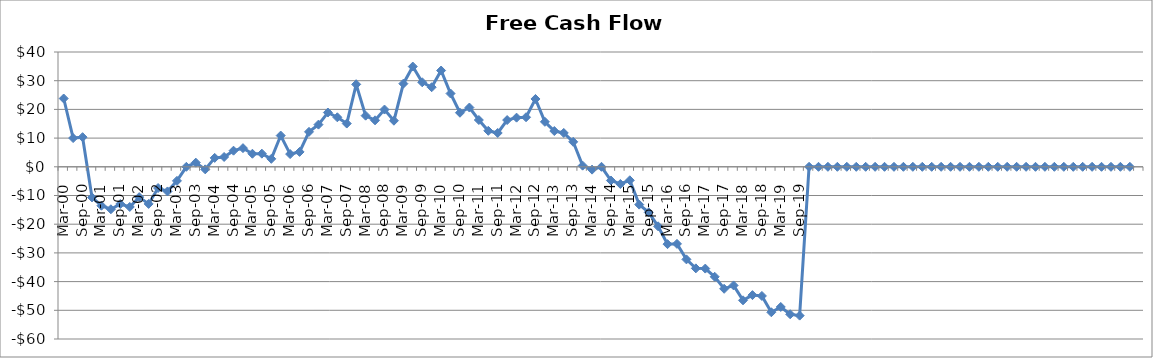
| Category | Series 0 |
|---|---|
| Mar-00 | 23.798 |
| Jun-00 | 10.012 |
| Sep-00 | 10.324 |
| Dec-00 | -10.677 |
| Mar-01 | -13.558 |
| Jun-01 | -14.799 |
| Sep-01 | -12.957 |
| Dec-01 | -13.993 |
| Mar-02 | -10.566 |
| Jun-02 | -12.934 |
| Sep-02 | -7.404 |
| Dec-02 | -8.587 |
| Mar-03 | -4.901 |
| Jun-03 | 0 |
| Sep-03 | 1.446 |
| Dec-03 | -0.888 |
| Mar-04 | 3.104 |
| Jun-04 | 3.423 |
| Sep-04 | 5.61 |
| Dec-04 | 6.5 |
| Mar-05 | 4.55 |
| Jun-05 | 4.58 |
| Sep-05 | 2.78 |
| Dec-05 | 10.888 |
| Mar-06 | 4.432 |
| Jun-06 | 5.189 |
| Sep-06 | 12.184 |
| Dec-06 | 14.7 |
| Mar-07 | 18.911 |
| Jun-07 | 17.251 |
| Sep-07 | 15.066 |
| Dec-07 | 28.724 |
| Mar-08 | 17.822 |
| Jun-08 | 16.195 |
| Sep-08 | 19.953 |
| Dec-08 | 16.061 |
| Mar-09 | 28.97 |
| Jun-09 | 34.926 |
| Sep-09 | 29.452 |
| Dec-09 | 27.726 |
| Mar-10 | 33.544 |
| Jun-10 | 25.532 |
| Sep-10 | 18.837 |
| Dec-10 | 20.648 |
| Mar-11 | 16.306 |
| Jun-11 | 12.544 |
| Sep-11 | 11.785 |
| Dec-11 | 16.288 |
| Mar-12 | 17.128 |
| Jun-12 | 17.266 |
| Sep-12 | 23.636 |
| Dec-12 | 15.678 |
| Mar-13 | 12.462 |
| Jun-13 | 11.796 |
| Sep-13 | 8.704 |
| Dec-13 | 0.4 |
| Mar-14 | -0.988 |
| Jun-14 | 0 |
| Sep-14 | -4.768 |
| Dec-14 | -5.991 |
| Mar-15 | -4.702 |
| Jun-15 | -13.179 |
| Sep-15 | -15.868 |
| Dec-15 | -20.745 |
| Mar-16 | -26.949 |
| Jun-16 | -26.855 |
| Sep-16 | -32.255 |
| Dec-16 | -35.392 |
| Mar-17 | -35.463 |
| Jun-17 | -38.317 |
| Sep-17 | -42.507 |
| Dec-17 | -41.332 |
| Mar-18 | -46.525 |
| Jun-18 | -44.712 |
| Sep-18 | -44.996 |
| Dec-18 | -50.68 |
| Mar-19 | -48.835 |
| Jun-19 | -51.385 |
| Sep-19 | -51.855 |